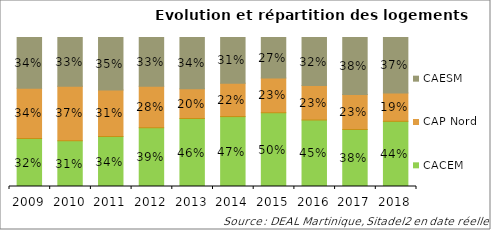
| Category | CACEM | CAP Nord | CAESM |
|---|---|---|---|
| 2009 | 0.322 | 0.338 | 0.34 |
| 2010 | 0.307 | 0.366 | 0.327 |
| 2011 | 0.335 | 0.313 | 0.352 |
| 2012 | 0.394 | 0.278 | 0.328 |
| 2013 | 0.456 | 0.199 | 0.345 |
| 2014 | 0.469 | 0.224 | 0.307 |
| 2015 | 0.495 | 0.233 | 0.272 |
| 2016 | 0.446 | 0.231 | 0.323 |
| 2017 | 0.382 | 0.235 | 0.383 |
| 2018 | 0.437 | 0.19 | 0.372 |